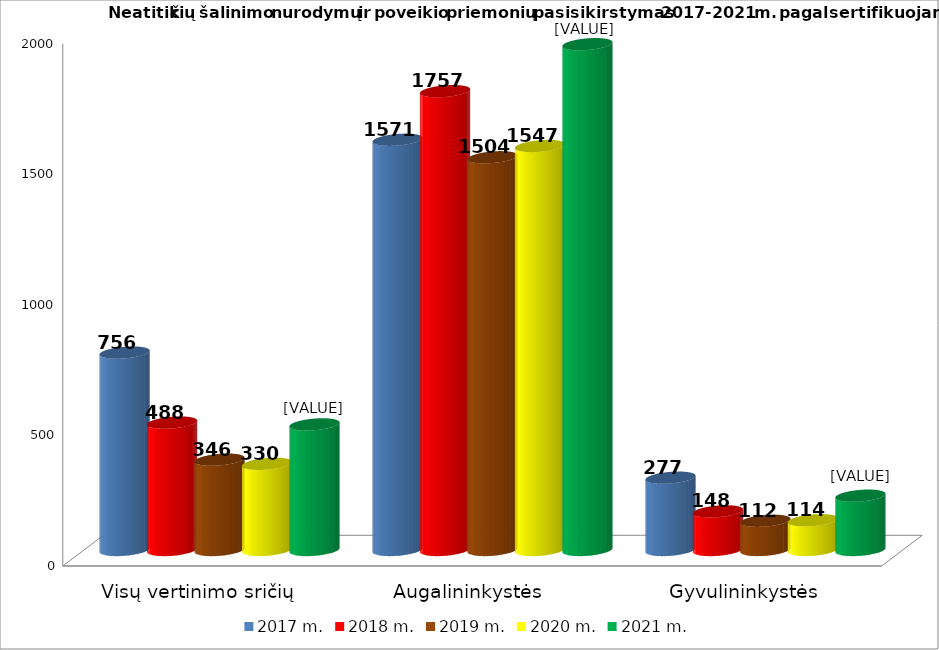
| Category | 2017 m. | 2018 m. | 2019 m. | 2020 m. | 2021 m. |
|---|---|---|---|---|---|
| Visų vertinimo sričių | 756 | 488 | 346 | 330 | 481 |
| Augalininkystės  | 1571 | 1757 | 1504 | 1547 | 1937 |
| Gyvulininkystės | 277 | 148 | 112 | 114 | 208 |